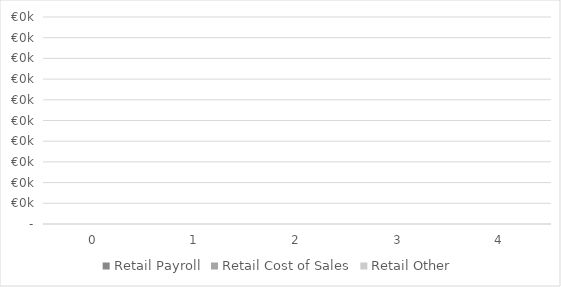
| Category | Retail Payroll | Retail Cost of Sales | Retail Other |
|---|---|---|---|
| 0.0 | 0 | 0 | 0 |
| 1.0 | 0 | 0 | 0 |
| 2.0 | 0 | 0 | 0 |
| 3.0 | 0 | 0 | 0 |
| 4.0 | 0 | 0 | 0 |